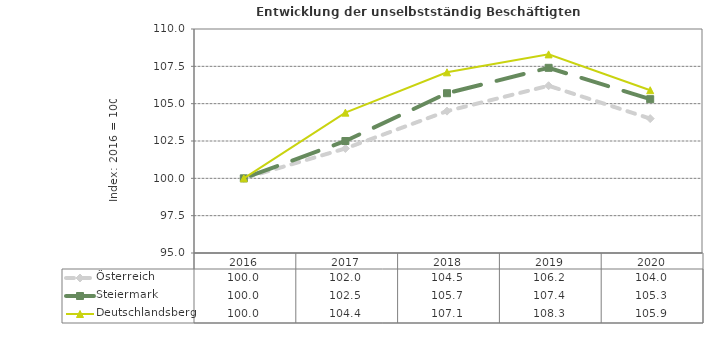
| Category | Österreich | Steiermark | Deutschlandsberg |
|---|---|---|---|
| 2020.0 | 104 | 105.3 | 105.9 |
| 2019.0 | 106.2 | 107.4 | 108.3 |
| 2018.0 | 104.5 | 105.7 | 107.1 |
| 2017.0 | 102 | 102.5 | 104.4 |
| 2016.0 | 100 | 100 | 100 |